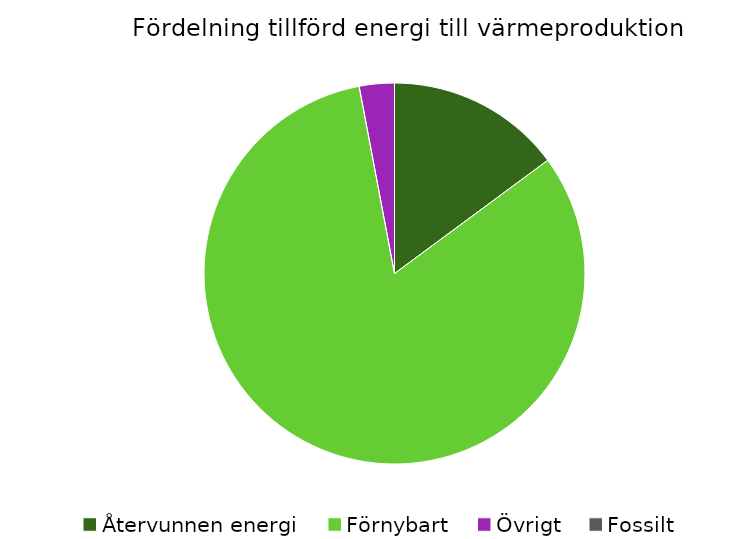
| Category | Fördelning värmeproduktion |
|---|---|
| Återvunnen energi | 0.149 |
| Förnybart | 0.822 |
| Övrigt | 0.03 |
| Fossilt | 0 |